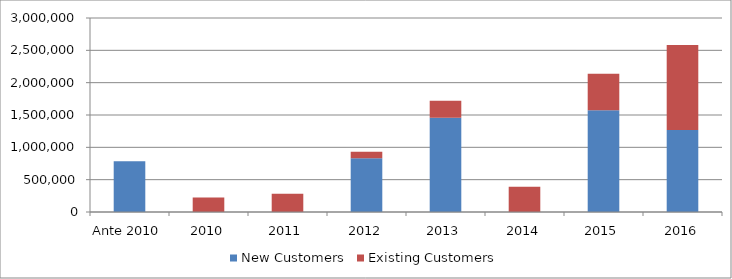
| Category | New Customers | Existing Customers |
|---|---|---|
| Ante 2010 | 786000 | 0 |
| 2010 | 0 | 226000 |
| 2011 | 0 | 282823 |
| 2012 | 831000 | 99600 |
| 2013 | 1456482.27 | 262350 |
| 2014 | 0 | 390200 |
| 2015 | 1575029.027 | 563200 |
| 2016 | 1267775.808 | 1314121.505 |